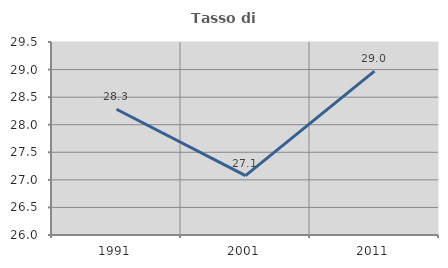
| Category | Tasso di occupazione   |
|---|---|
| 1991.0 | 28.28 |
| 2001.0 | 27.076 |
| 2011.0 | 28.972 |